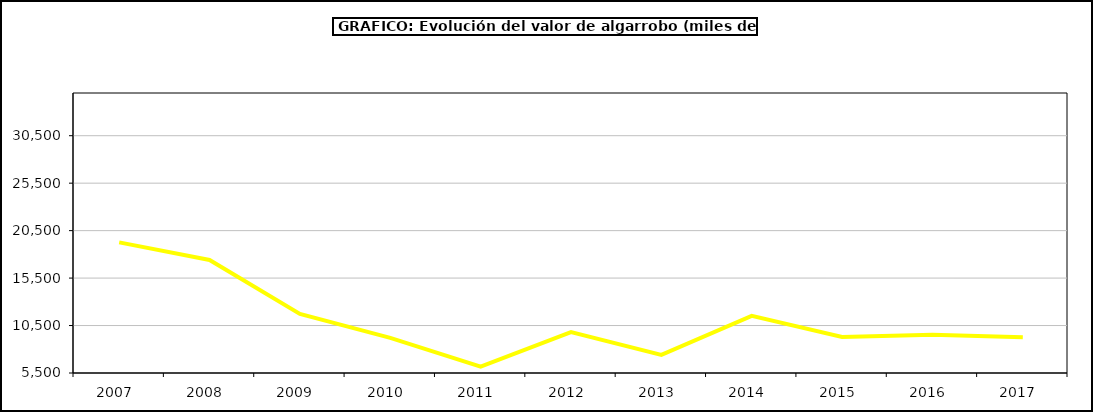
| Category | producción |
|---|---|
| 2007.0 | 19261.476 |
| 2008.0 | 17411.688 |
| 2009.0 | 11720.401 |
| 2010.0 | 9197.132 |
| 2011.0 | 6163.828 |
| 2012.0 | 9804.883 |
| 2013.0 | 7410.909 |
| 2014.0 | 11518 |
| 2015.0 | 9297 |
| 2016.0 | 9540 |
| 2017.0 | 9266.566 |